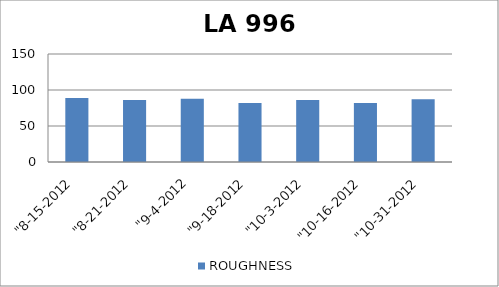
| Category | ROUGHNESS |
|---|---|
| "8-15-2012 | 89 |
| "8-21-2012 | 86 |
| "9-4-2012 | 88 |
| "9-18-2012 | 82 |
| "10-3-2012 | 86 |
| "10-16-2012 | 82 |
| "10-31-2012 | 87 |